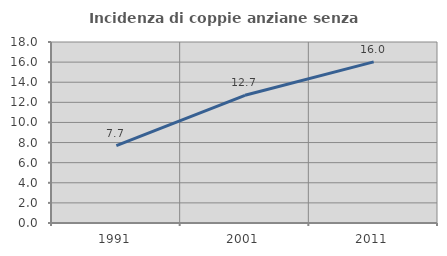
| Category | Incidenza di coppie anziane senza figli  |
|---|---|
| 1991.0 | 7.692 |
| 2001.0 | 12.702 |
| 2011.0 | 16.026 |